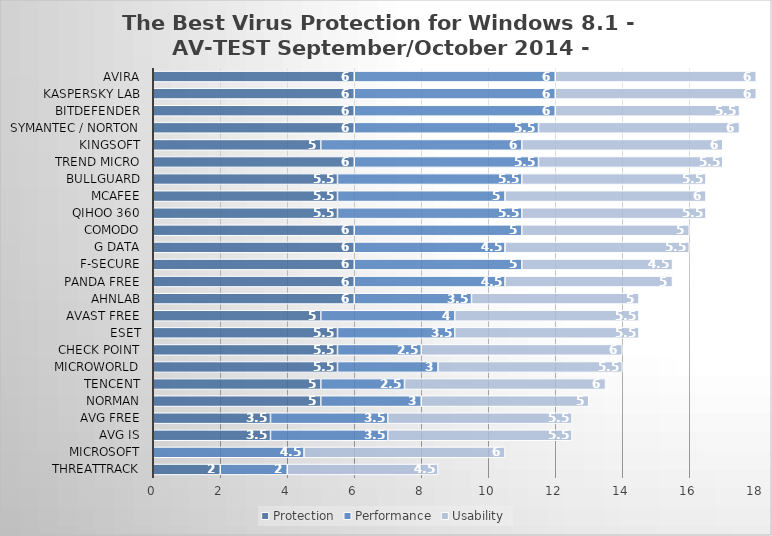
| Category | Protection | Performance | Usability |
|---|---|---|---|
| ThreatTrack | 2 | 2 | 4.5 |
| Microsoft | 0 | 4.5 | 6 |
| AVG IS | 3.5 | 3.5 | 5.5 |
| AVG Free | 3.5 | 3.5 | 5.5 |
| Norman | 5 | 3 | 5 |
| Tencent | 5 | 2.5 | 6 |
| Microworld | 5.5 | 3 | 5.5 |
| Check Point | 5.5 | 2.5 | 6 |
| ESET | 5.5 | 3.5 | 5.5 |
| Avast Free | 5 | 4 | 5.5 |
| AhnLab | 6 | 3.5 | 5 |
| Panda Free | 6 | 4.5 | 5 |
| F-Secure | 6 | 5 | 4.5 |
| G Data | 6 | 4.5 | 5.5 |
| Comodo | 6 | 5 | 5 |
| Qihoo 360 | 5.5 | 5.5 | 5.5 |
| McAfee | 5.5 | 5 | 6 |
| BullGuard | 5.5 | 5.5 | 5.5 |
| Trend Micro | 6 | 5.5 | 5.5 |
| Kingsoft | 5 | 6 | 6 |
| Symantec / Norton | 6 | 5.5 | 6 |
| Bitdefender | 6 | 6 | 5.5 |
| Kaspersky Lab | 6 | 6 | 6 |
| Avira | 6 | 6 | 6 |